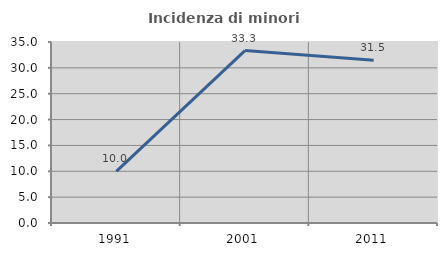
| Category | Incidenza di minori stranieri |
|---|---|
| 1991.0 | 10 |
| 2001.0 | 33.333 |
| 2011.0 | 31.488 |